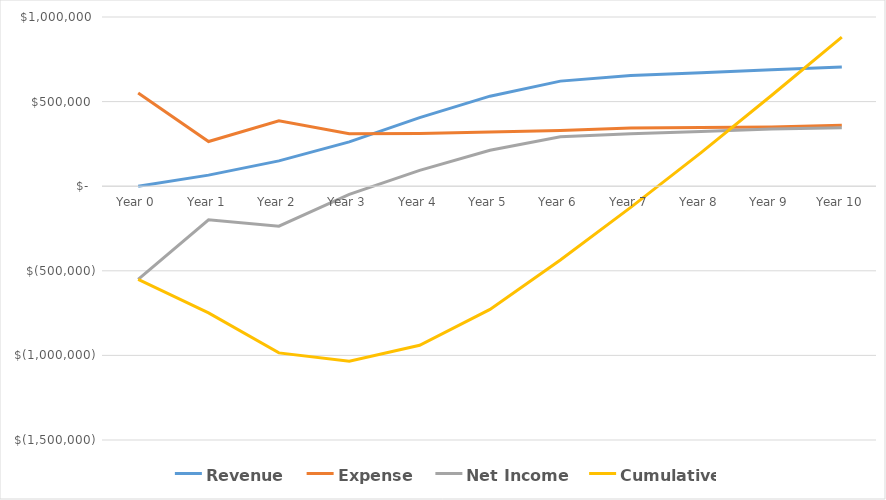
| Category |  Revenue  |  Expense  |  Net Income  |  Cumulative Net Income  |
|---|---|---|---|---|
|  Year 0  | 0 | 550373 | -550373 | -550373 |
|  Year 1  | 65475 | 263852.6 | -198377.6 | -748750.6 |
|  Year 2  | 149850 | 386168.4 | -236318.4 | -985069 |
|  Year 3  | 261820 | 310604.2 | -48784.2 | -1033853.2 |
|  Year 4  | 405244 | 311552.4 | 93691.6 | -940161.6 |
|  Year 5  | 532140 | 320058 | 212082 | -728079.6 |
|  Year 6  | 621054 | 328800 | 292254 | -435825.6 |
|  Year 7  | 654460 | 343783.2 | 310676.8 | -125148.8 |
|  Year 8  | 670800 | 347014.8 | 323785.2 | 198636.4 |
|  Year 9  | 688000 | 350500.8 | 337499.2 | 536135.6 |
|  Year 10  | 705200 | 359950.8 | 345249.2 | 881384.8 |